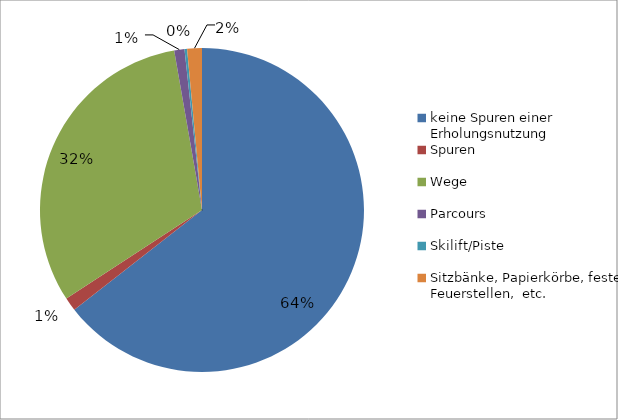
| Category | Anz |
|---|---|
| keine Spuren einer Erholungsnutzung | 1008 |
| Spuren | 21 |
| Wege | 492 |
| Parcours | 16 |
| Skilift/Piste | 4 |
| Sitzbänke, Papierkörbe, feste Feuerstellen,  etc. | 23 |